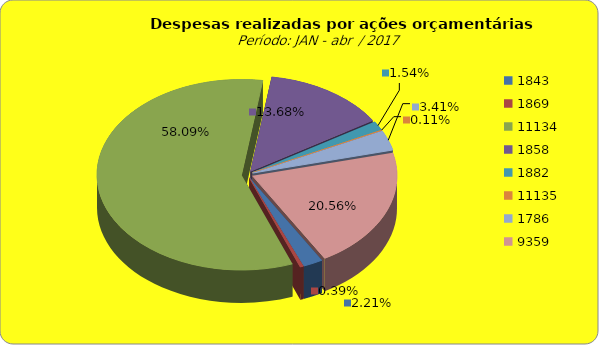
| Category | Series 1 |
|---|---|
| 1843.0 | 2054886.66 |
| 1869.0 | 362143.34 |
| 11134.0 | 54027025.31 |
| 1858.0 | 12725662.84 |
| 1882.0 | 1433469.61 |
| 11135.0 | 103786.5 |
| 1786.0 | 3175518.25 |
| 9359.0 | 19125267.61 |